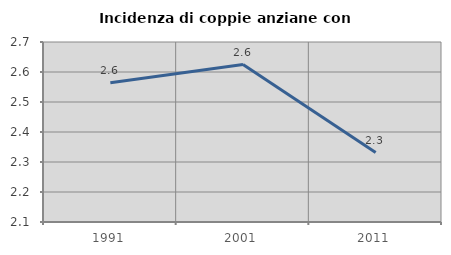
| Category | Incidenza di coppie anziane con figli |
|---|---|
| 1991.0 | 2.564 |
| 2001.0 | 2.625 |
| 2011.0 | 2.332 |